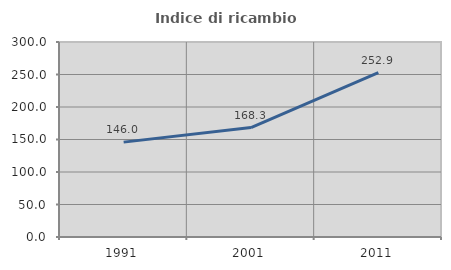
| Category | Indice di ricambio occupazionale  |
|---|---|
| 1991.0 | 145.96 |
| 2001.0 | 168.306 |
| 2011.0 | 252.907 |